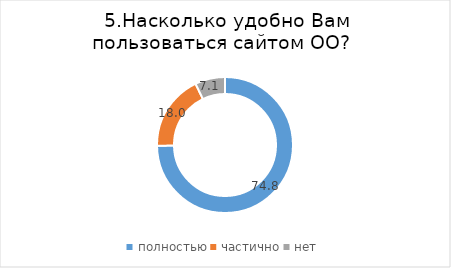
| Category | Series 0 |
|---|---|
| полностью | 74.83 |
| частично | 18.041 |
| нет | 7.13 |